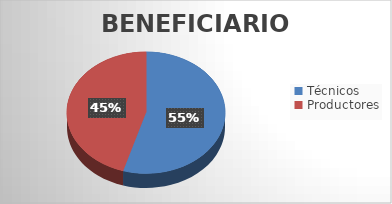
| Category | Series 0 |
|---|---|
| Técnicos  | 47 |
| Productores  | 39 |